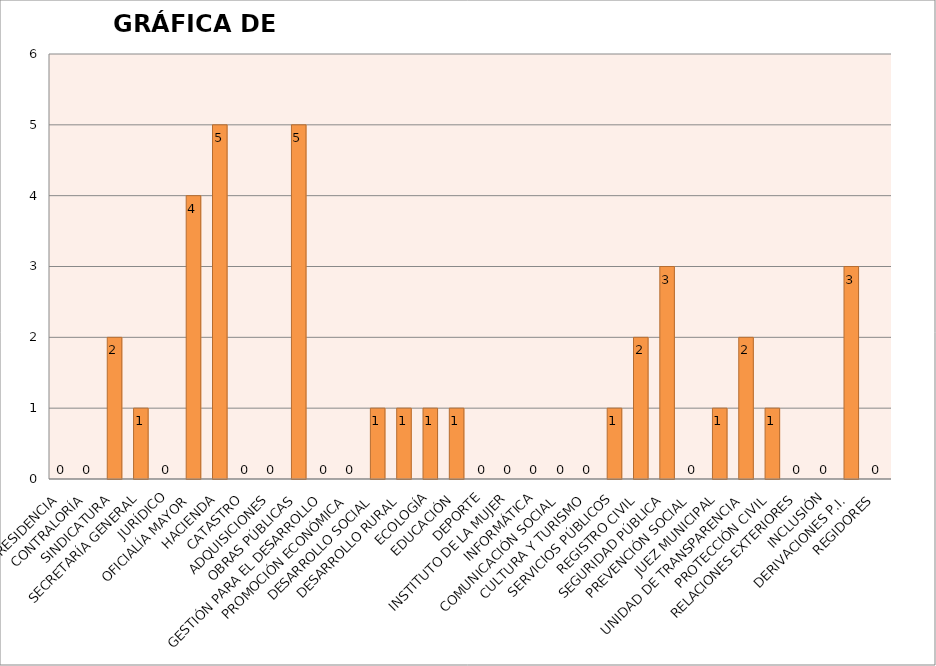
| Category | Series 0 |
|---|---|
| PRESIDENCIA | 0 |
| CONTRALORÍA | 0 |
| SINDICATURA | 2 |
| SECRETARÍA GENERAL | 1 |
| JURÍDICO | 0 |
| OFICIALÍA MAYOR | 4 |
| HACIENDA | 5 |
| CATASTRO | 0 |
| ADQUISICIONES | 0 |
| OBRAS PÚBLICAS | 5 |
| GESTIÓN PARA EL DESARROLLO | 0 |
| PROMOCIÓN ECONÓMICA | 0 |
| DESARROLLO SOCIAL | 1 |
| DESARROLLO RURAL | 1 |
| ECOLOGÍA | 1 |
| EDUCACIÓN | 1 |
| DEPORTE | 0 |
| INSTITUTO DE LA MUJER | 0 |
| INFORMÁTICA | 0 |
| COMUNICACIÓN SOCIAL | 0 |
| CULTURA Y TURISMO | 0 |
| SERVICIOS PÚBLICOS | 1 |
| REGISTRO CIVIL | 2 |
| SEGURIDAD PÚBLICA | 3 |
| PREVENCIÓN SOCIAL | 0 |
| JUEZ MUNICIPAL | 1 |
| UNIDAD DE TRANSPARENCIA | 2 |
| PROTECCIÓN CIVIL | 1 |
| RELACIONES EXTERIORES | 0 |
| INCLUSIÓN | 0 |
| DERIVACIONES P.I. | 3 |
| REGIDORES | 0 |